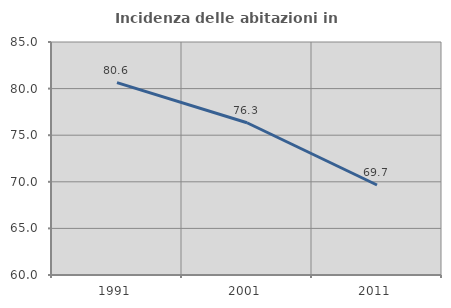
| Category | Incidenza delle abitazioni in proprietà  |
|---|---|
| 1991.0 | 80.645 |
| 2001.0 | 76.336 |
| 2011.0 | 69.655 |